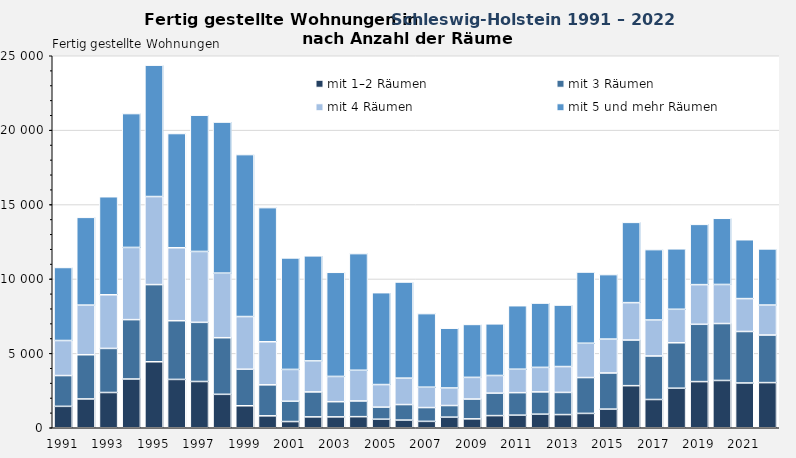
| Category | mit 1–2 Räumen | mit 3 Räumen | mit 4 Räumen | mit 5 und mehr Räumen |
|---|---|---|---|---|
| 1991.0 | 1439 | 2069 | 2355 | 4908 |
| 1992.0 | 1937 | 2969 | 3338 | 5896 |
| 1993.0 | 2370 | 2962 | 3605 | 6589 |
| 1994.0 | 3277 | 3989 | 4852 | 8996 |
| 1995.0 | 4435 | 5186 | 5917 | 8831 |
| 1996.0 | 3248 | 3946 | 4903 | 7676 |
| 1997.0 | 3109 | 3975 | 4764 | 9158 |
| 1998.0 | 2247 | 3804 | 4340 | 10152 |
| 1999.0 | 1478 | 2455 | 3541 | 10884 |
| 2000.0 | 802 | 2083 | 2895 | 9014 |
| 2001.0 | 417 | 1363 | 2140 | 7494 |
| 2002.0 | 731 | 1677 | 2084 | 7060 |
| 2003.0 | 731 | 1020 | 1698 | 6998 |
| 2004.0 | 745 | 1056 | 2063 | 7840 |
| 2005.0 | 575 | 812 | 1516 | 6175 |
| 2006.0 | 516 | 1043 | 1777 | 6458 |
| 2007.0 | 430 | 927 | 1369 | 4945 |
| 2008.0 | 713 | 781 | 1180 | 4016 |
| 2009.0 | 598 | 1331 | 1457 | 3558 |
| 2010.0 | 816 | 1510 | 1187 | 3469 |
| 2011.0 | 847 | 1512 | 1575 | 4269 |
| 2012.0 | 913 | 1497 | 1648 | 4320 |
| 2013.0 | 886 | 1489 | 1738 | 4132 |
| 2014.0 | 965 | 2408 | 2307 | 4784 |
| 2015.0 | 1253 | 2428 | 2279 | 4333 |
| 2016.0 | 2828 | 3067 | 2513 | 5395 |
| 2017.0 | 1899 | 2926 | 2417 | 4730 |
| 2018.0 | 2658 | 3053 | 2251 | 4063 |
| 2019.0 | 3101 | 3852 | 2665 | 4050 |
| 2020.0 | 3178 | 3826 | 2626 | 4447 |
| 2021.0 | 3010 | 3459 | 2210 | 3957 |
| 2022.0 | 3034 | 3198 | 2015 | 3774 |